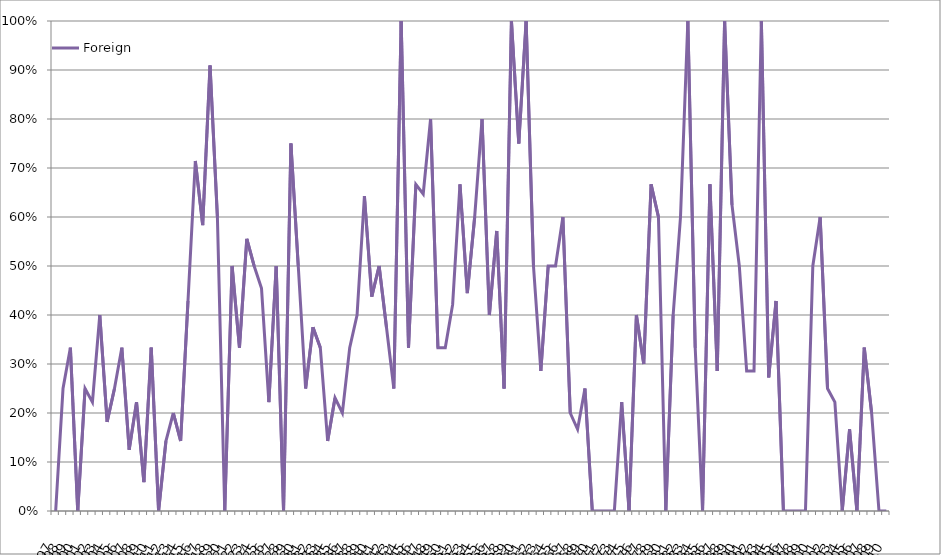
| Category | Foreign |
|---|---|
| 1897.0 | 0 |
| 1898.0 | 0.25 |
| 1899.0 | 0.333 |
| 1900.0 | 0 |
| 1901.0 | 0.25 |
| 1902.0 | 0.222 |
| 1903.0 | 0.4 |
| 1904.0 | 0.182 |
| 1905.0 | 0.25 |
| 1906.0 | 0.333 |
| 1907.0 | 0.125 |
| 1908.0 | 0.222 |
| 1909.0 | 0.059 |
| 1910.0 | 0.333 |
| 1911.0 | 0 |
| 1912.0 | 0.143 |
| 1913.0 | 0.2 |
| 1914.0 | 0.143 |
| 1915.0 | 0.429 |
| 1916.0 | 0.714 |
| 1917.0 | 0.583 |
| 1918.0 | 0.909 |
| 1919.0 | 0.6 |
| 1920.0 | 0 |
| 1921.0 | 0.5 |
| 1922.0 | 0.333 |
| 1923.0 | 0.556 |
| 1924.0 | 0.5 |
| 1925.0 | 0.455 |
| 1926.0 | 0.222 |
| 1927.0 | 0.5 |
| 1928.0 | 0 |
| 1929.0 | 0.75 |
| 1930.0 | 0.5 |
| 1931.0 | 0.25 |
| 1932.0 | 0.375 |
| 1933.0 | 0.333 |
| 1934.0 | 0.143 |
| 1935.0 | 0.231 |
| 1936.0 | 0.2 |
| 1937.0 | 0.333 |
| 1938.0 | 0.4 |
| 1939.0 | 0.643 |
| 1940.0 | 0.438 |
| 1941.0 | 0.5 |
| 1942.0 | 0.375 |
| 1943.0 | 0.25 |
| 1944.0 | 1 |
| 1945.0 | 0.333 |
| 1946.0 | 0.667 |
| 1947.0 | 0.647 |
| 1948.0 | 0.8 |
| 1949.0 | 0.333 |
| 1950.0 | 0.333 |
| 1951.0 | 0.421 |
| 1952.0 | 0.667 |
| 1953.0 | 0.444 |
| 1954.0 | 0.6 |
| 1955.0 | 0.8 |
| 1956.0 | 0.4 |
| 1957.0 | 0.571 |
| 1958.0 | 0.25 |
| 1959.0 | 1 |
| 1960.0 | 0.75 |
| 1961.0 | 1 |
| 1962.0 | 0.5 |
| 1963.0 | 0.286 |
| 1964.0 | 0.5 |
| 1965.0 | 0.5 |
| 1966.0 | 0.6 |
| 1967.0 | 0.2 |
| 1968.0 | 0.167 |
| 1969.0 | 0.25 |
| 1970.0 | 0 |
| 1971.0 | 0 |
| 1972.0 | 0 |
| 1973.0 | 0 |
| 1974.0 | 0.222 |
| 1975.0 | 0 |
| 1976.0 | 0.4 |
| 1977.0 | 0.3 |
| 1978.0 | 0.667 |
| 1979.0 | 0.6 |
| 1980.0 | 0 |
| 1981.0 | 0.4 |
| 1982.0 | 0.6 |
| 1983.0 | 1 |
| 1984.0 | 0.333 |
| 1985.0 | 0 |
| 1986.0 | 0.667 |
| 1987.0 | 0.286 |
| 1988.0 | 1 |
| 1989.0 | 0.625 |
| 1990.0 | 0.5 |
| 1991.0 | 0.286 |
| 1992.0 | 0.286 |
| 1993.0 | 1 |
| 1994.0 | 0.273 |
| 1995.0 | 0.429 |
| 1996.0 | 0 |
| 1997.0 | 0 |
| 1998.0 | 0 |
| 1999.0 | 0 |
| 2000.0 | 0.5 |
| 2001.0 | 0.6 |
| 2002.0 | 0.25 |
| 2003.0 | 0.222 |
| 2004.0 | 0 |
| 2005.0 | 0.167 |
| 2006.0 | 0 |
| 2007.0 | 0.333 |
| 2008.0 | 0.2 |
| 2009.0 | 0 |
| 2010.0 | 0 |